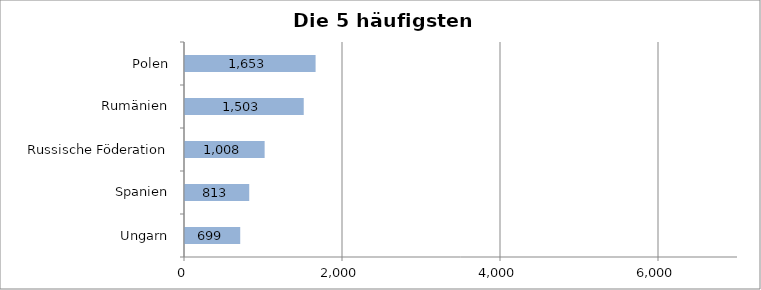
| Category | Series 0 |
|---|---|
| Ungarn | 699 |
| Spanien | 813 |
| Russische Föderation | 1008 |
| Rumänien | 1503 |
| Polen | 1653 |